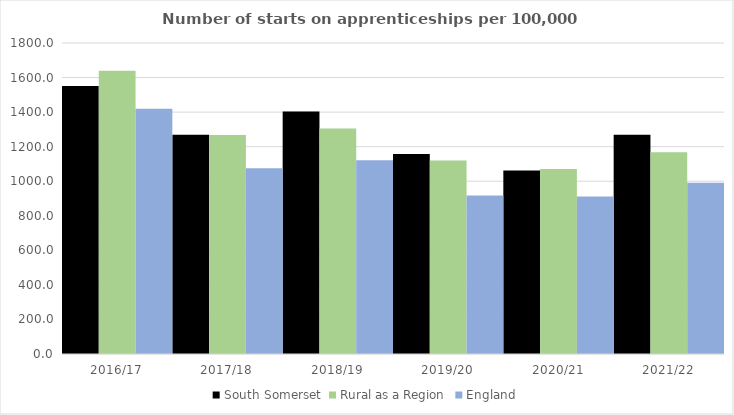
| Category | South Somerset | Rural as a Region | England |
|---|---|---|---|
| 2016/17 | 1551 | 1638.789 | 1420 |
| 2017/18 | 1269 | 1267.474 | 1075 |
| 2018/19 | 1403 | 1304.57 | 1122 |
| 2019/20 | 1158 | 1119.662 | 918 |
| 2020/21 | 1062 | 1070.748 | 912 |
| 2021/22 | 1269 | 1167.68 | 991 |